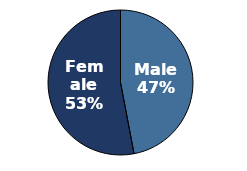
| Category | Series 0 |
|---|---|
| Male | 0.47 |
| Female | 0.53 |